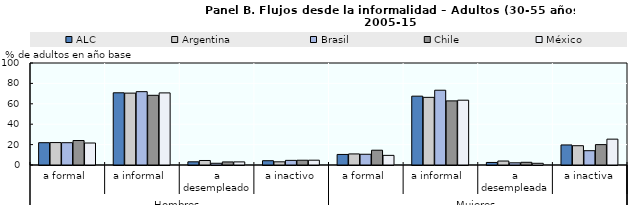
| Category | ALC | Argentina  | Brasil | Chile | México  |
|---|---|---|---|---|---|
| 0 | 21.875 | 21.988 | 21.866 | 23.992 | 21.554 |
| 1 | 70.795 | 70.471 | 71.904 | 68.328 | 70.693 |
| 2 | 3.118 | 4.421 | 1.688 | 3.008 | 3.044 |
| 3 | 4.212 | 3.119 | 4.541 | 4.672 | 4.708 |
| 4 | 10.34 | 10.856 | 10.529 | 14.502 | 9.45 |
| 5 | 67.49 | 66.326 | 73.306 | 62.854 | 63.538 |
| 6 | 2.504 | 3.905 | 2.144 | 2.665 | 1.666 |
| 7 | 19.665 | 18.913 | 14.022 | 19.979 | 25.346 |